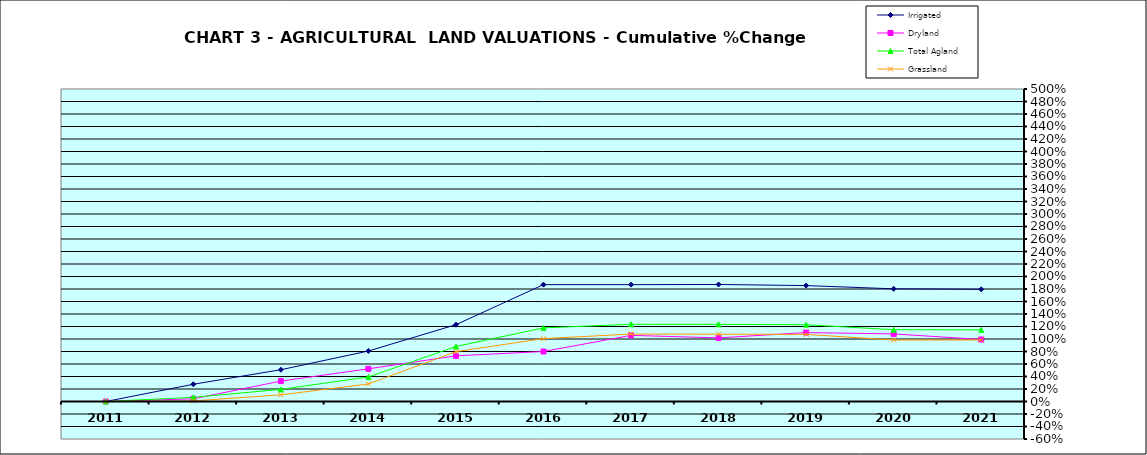
| Category | Irrigated | Dryland | Total Agland | Grassland |
|---|---|---|---|---|
| 2011.0 | 0 | 0 | 0 | 0 |
| 2012.0 | 0.276 | 0.043 | 0.067 | 0.009 |
| 2013.0 | 0.508 | 0.326 | 0.194 | 0.107 |
| 2014.0 | 0.808 | 0.523 | 0.393 | 0.281 |
| 2015.0 | 1.229 | 0.731 | 0.88 | 0.798 |
| 2016.0 | 1.87 | 0.8 | 1.178 | 1.006 |
| 2017.0 | 1.87 | 1.058 | 1.235 | 1.079 |
| 2018.0 | 1.872 | 1.018 | 1.234 | 1.077 |
| 2019.0 | 1.855 | 1.103 | 1.228 | 1.074 |
| 2020.0 | 1.803 | 1.081 | 1.149 | 0.984 |
| 2021.0 | 1.795 | 0.992 | 1.147 | 0.985 |